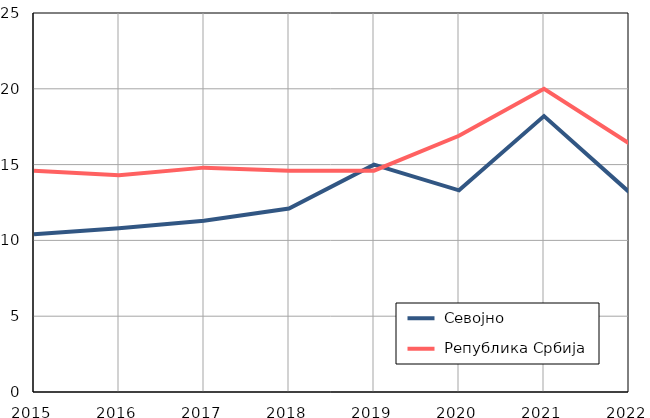
| Category |  Севојно |  Република Србија |
|---|---|---|
| 2015.0 | 10.4 | 14.6 |
| 2016.0 | 10.8 | 14.3 |
| 2017.0 | 11.3 | 14.8 |
| 2018.0 | 12.1 | 14.6 |
| 2019.0 | 15 | 14.6 |
| 2020.0 | 13.3 | 16.9 |
| 2021.0 | 18.2 | 20 |
| 2022.0 | 13.2 | 16.4 |